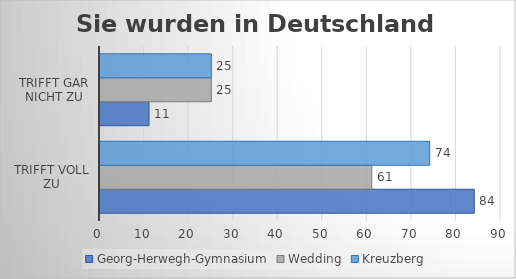
| Category | Georg-Herwegh-Gymnasium | Wedding | Kreuzberg |
|---|---|---|---|
| trifft voll zu | 84 | 61 | 74 |
| trifft gar nicht zu | 11 | 25 | 25 |